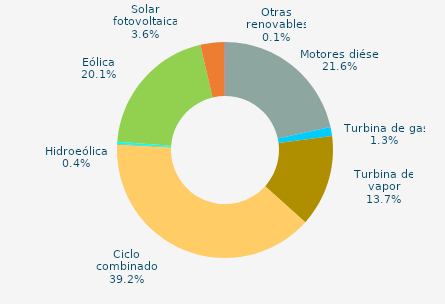
| Category | Series 0 |
|---|---|
| Motores diésel | 21.596 |
| Turbina de gas | 1.341 |
| Turbina de vapor | 13.727 |
| Ciclo combinado | 39.164 |
| Cogeneración | 0 |
| Hidráulica | 0.039 |
| Hidroeólica | 0.367 |
| Eólica | 20.093 |
| Solar fotovoltaica | 3.596 |
| Otras renovables | 0.078 |